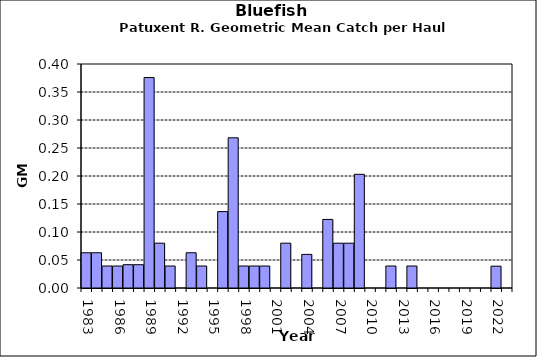
| Category | Series 0 |
|---|---|
| 1983.0 | 0.063 |
| 1984.0 | 0.063 |
| 1985.0 | 0.039 |
| 1986.0 | 0.039 |
| 1987.0 | 0.042 |
| 1988.0 | 0.042 |
| 1989.0 | 0.376 |
| 1990.0 | 0.08 |
| 1991.0 | 0.039 |
| 1992.0 | 0 |
| 1993.0 | 0.063 |
| 1994.0 | 0.039 |
| 1995.0 | 0 |
| 1996.0 | 0.136 |
| 1997.0 | 0.268 |
| 1998.0 | 0.039 |
| 1999.0 | 0.039 |
| 2000.0 | 0.039 |
| 2001.0 | 0 |
| 2002.0 | 0.08 |
| 2003.0 | 0 |
| 2004.0 | 0.06 |
| 2005.0 | 0 |
| 2006.0 | 0.122 |
| 2007.0 | 0.08 |
| 2008.0 | 0.08 |
| 2009.0 | 0.203 |
| 2010.0 | 0 |
| 2011.0 | 0 |
| 2012.0 | 0.039 |
| 2013.0 | 0 |
| 2014.0 | 0.039 |
| 2015.0 | 0 |
| 2016.0 | 0 |
| 2017.0 | 0 |
| 2018.0 | 0 |
| 2019.0 | 0 |
| 2020.0 | 0 |
| 2021.0 | 0 |
| 2022.0 | 0.039 |
| 2023.0 | 0 |